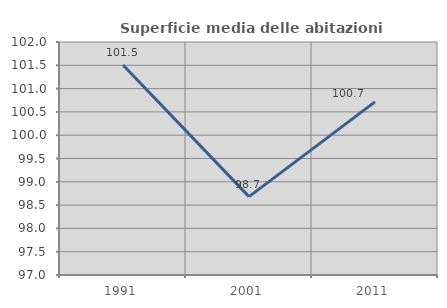
| Category | Superficie media delle abitazioni occupate |
|---|---|
| 1991.0 | 101.506 |
| 2001.0 | 98.682 |
| 2011.0 | 100.716 |